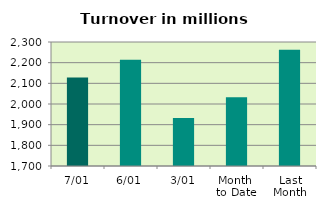
| Category | Series 0 |
|---|---|
| 7/01 | 2128.13 |
| 6/01 | 2214.102 |
| 3/01 | 1932.469 |
| Month 
to Date | 2033.102 |
| Last
Month | 2262.611 |